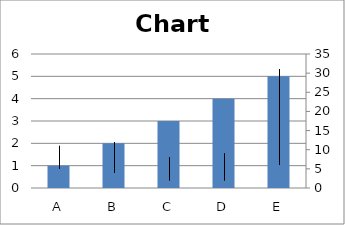
| Category | Series 0 |
|---|---|
| A | 1 |
| B | 2 |
| C | 3 |
| D | 4 |
| E | 5 |